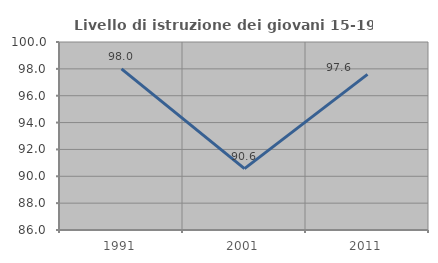
| Category | Livello di istruzione dei giovani 15-19 anni |
|---|---|
| 1991.0 | 98 |
| 2001.0 | 90.566 |
| 2011.0 | 97.59 |